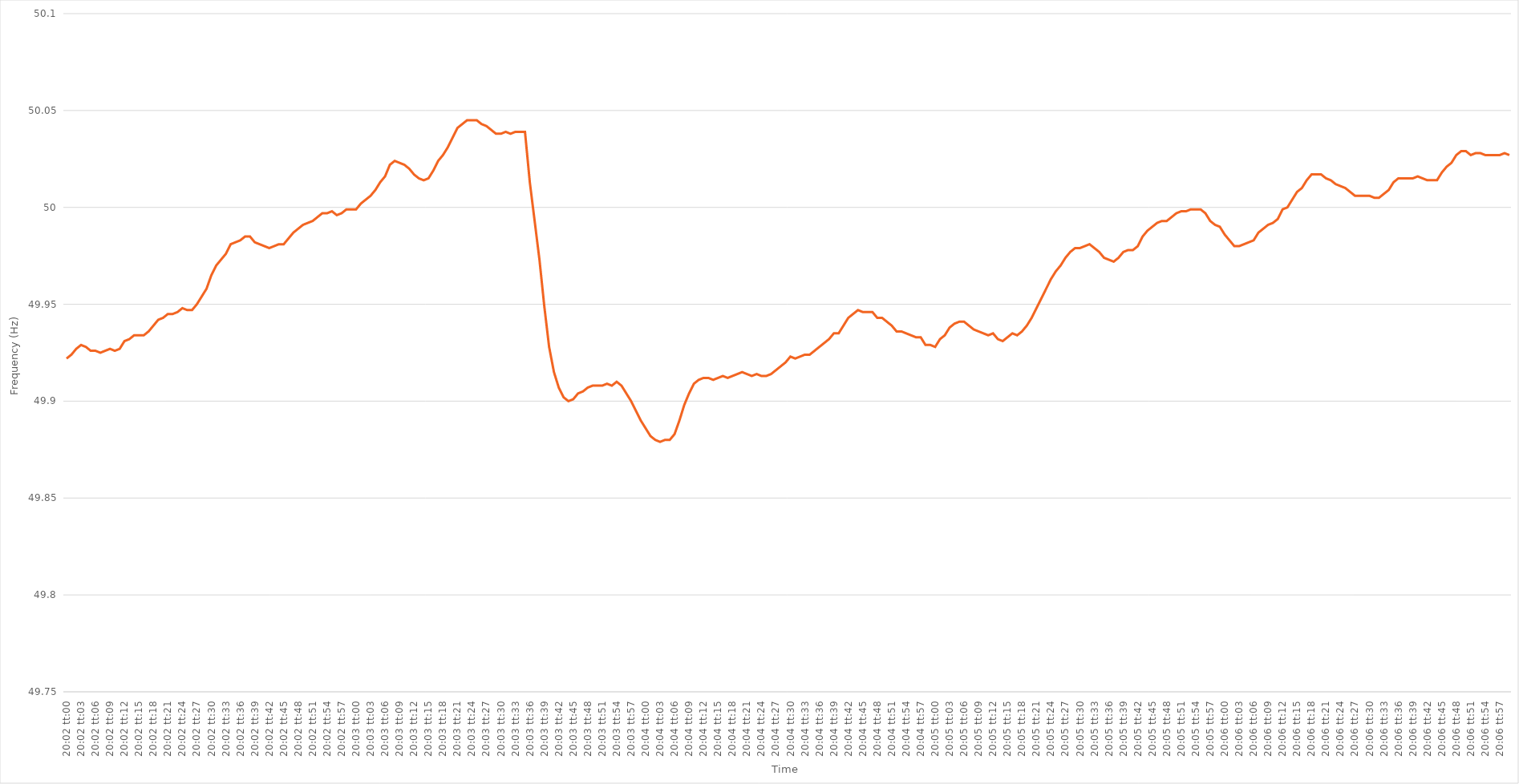
| Category | Series 0 |
|---|---|
| 0.8347222222222223 | 49.922 |
| 0.8347337962962963 | 49.924 |
| 0.8347453703703703 | 49.927 |
| 0.8347569444444445 | 49.929 |
| 0.8347685185185184 | 49.928 |
| 0.8347800925925926 | 49.926 |
| 0.8347916666666667 | 49.926 |
| 0.8348032407407407 | 49.925 |
| 0.8348148148148148 | 49.926 |
| 0.8348263888888888 | 49.927 |
| 0.834837962962963 | 49.926 |
| 0.8348495370370371 | 49.927 |
| 0.834861111111111 | 49.931 |
| 0.8348726851851852 | 49.932 |
| 0.8348842592592592 | 49.934 |
| 0.8348958333333334 | 49.934 |
| 0.8349074074074073 | 49.934 |
| 0.8349189814814815 | 49.936 |
| 0.8349305555555556 | 49.939 |
| 0.8349421296296297 | 49.942 |
| 0.8349537037037037 | 49.943 |
| 0.8349652777777777 | 49.945 |
| 0.8349768518518519 | 49.945 |
| 0.834988425925926 | 49.946 |
| 0.835 | 49.948 |
| 0.8350115740740741 | 49.947 |
| 0.8350231481481482 | 49.947 |
| 0.8350347222222222 | 49.95 |
| 0.8350462962962962 | 49.954 |
| 0.8350578703703704 | 49.958 |
| 0.8350694444444445 | 49.965 |
| 0.8350810185185185 | 49.97 |
| 0.8350925925925926 | 49.973 |
| 0.8351041666666666 | 49.976 |
| 0.8351157407407408 | 49.981 |
| 0.8351273148148147 | 49.982 |
| 0.8351388888888889 | 49.983 |
| 0.835150462962963 | 49.985 |
| 0.8351620370370371 | 49.985 |
| 0.8351736111111111 | 49.982 |
| 0.8351851851851851 | 49.981 |
| 0.8351967592592593 | 49.98 |
| 0.8352083333333334 | 49.979 |
| 0.8352199074074074 | 49.98 |
| 0.8352314814814815 | 49.981 |
| 0.8352430555555556 | 49.981 |
| 0.8352546296296296 | 49.984 |
| 0.8352662037037036 | 49.987 |
| 0.8352777777777778 | 49.989 |
| 0.8352893518518519 | 49.991 |
| 0.8353009259259259 | 49.992 |
| 0.8353125 | 49.993 |
| 0.835324074074074 | 49.995 |
| 0.8353356481481482 | 49.997 |
| 0.8353472222222221 | 49.997 |
| 0.8353587962962963 | 49.998 |
| 0.8353703703703704 | 49.996 |
| 0.8353819444444445 | 49.997 |
| 0.8353935185185185 | 49.999 |
| 0.8354050925925925 | 49.999 |
| 0.8354166666666667 | 49.999 |
| 0.8354282407407408 | 50.002 |
| 0.8354398148148148 | 50.004 |
| 0.8354513888888889 | 50.006 |
| 0.835462962962963 | 50.009 |
| 0.835474537037037 | 50.013 |
| 0.835486111111111 | 50.016 |
| 0.8354976851851852 | 50.022 |
| 0.8355092592592593 | 50.024 |
| 0.8355208333333333 | 50.023 |
| 0.8355324074074074 | 50.022 |
| 0.8355439814814815 | 50.02 |
| 0.8355555555555556 | 50.017 |
| 0.8355671296296295 | 50.015 |
| 0.8355787037037037 | 50.014 |
| 0.8355902777777778 | 50.015 |
| 0.8356018518518519 | 50.019 |
| 0.8356134259259259 | 50.024 |
| 0.835625 | 50.027 |
| 0.8356365740740741 | 50.031 |
| 0.8356481481481483 | 50.036 |
| 0.8356597222222222 | 50.041 |
| 0.8356712962962963 | 50.043 |
| 0.8356828703703704 | 50.045 |
| 0.8356944444444445 | 50.045 |
| 0.8357060185185184 | 50.045 |
| 0.8357175925925926 | 50.043 |
| 0.8357291666666667 | 50.042 |
| 0.8357407407407407 | 50.04 |
| 0.8357523148148148 | 50.038 |
| 0.8357638888888889 | 50.038 |
| 0.835775462962963 | 50.039 |
| 0.8357870370370369 | 50.038 |
| 0.8357986111111111 | 50.039 |
| 0.8358101851851852 | 50.039 |
| 0.8358217592592593 | 50.039 |
| 0.8358333333333333 | 50.013 |
| 0.8358449074074074 | 49.993 |
| 0.8358564814814815 | 49.973 |
| 0.8358680555555557 | 49.949 |
| 0.8358796296296296 | 49.928 |
| 0.8358912037037037 | 49.915 |
| 0.8359027777777778 | 49.907 |
| 0.8359143518518519 | 49.902 |
| 0.8359259259259259 | 49.9 |
| 0.8359375 | 49.901 |
| 0.8359490740740741 | 49.904 |
| 0.8359606481481481 | 49.905 |
| 0.8359722222222222 | 49.907 |
| 0.8359837962962963 | 49.908 |
| 0.8359953703703704 | 49.908 |
| 0.8360069444444443 | 49.908 |
| 0.8360185185185185 | 49.909 |
| 0.8360300925925926 | 49.908 |
| 0.8360416666666667 | 49.91 |
| 0.8360532407407407 | 49.908 |
| 0.8360648148148148 | 49.904 |
| 0.8360763888888889 | 49.9 |
| 0.8360879629629631 | 49.895 |
| 0.836099537037037 | 49.89 |
| 0.8361111111111111 | 49.886 |
| 0.8361226851851852 | 49.882 |
| 0.8361342592592593 | 49.88 |
| 0.8361458333333333 | 49.879 |
| 0.8361574074074074 | 49.88 |
| 0.8361689814814816 | 49.88 |
| 0.8361805555555555 | 49.883 |
| 0.8361921296296296 | 49.89 |
| 0.8362037037037037 | 49.898 |
| 0.8362152777777778 | 49.904 |
| 0.8362268518518517 | 49.909 |
| 0.8362384259259259 | 49.911 |
| 0.83625 | 49.912 |
| 0.8362615740740741 | 49.912 |
| 0.8362731481481481 | 49.911 |
| 0.8362847222222222 | 49.912 |
| 0.8362962962962963 | 49.913 |
| 0.8363078703703705 | 49.912 |
| 0.8363194444444444 | 49.913 |
| 0.8363310185185185 | 49.914 |
| 0.8363425925925926 | 49.915 |
| 0.8363541666666667 | 49.914 |
| 0.8363657407407407 | 49.913 |
| 0.8363773148148148 | 49.914 |
| 0.836388888888889 | 49.913 |
| 0.836400462962963 | 49.913 |
| 0.836412037037037 | 49.914 |
| 0.8364236111111111 | 49.916 |
| 0.8364351851851852 | 49.918 |
| 0.8364467592592592 | 49.92 |
| 0.8364583333333333 | 49.923 |
| 0.8364699074074075 | 49.922 |
| 0.8364814814814815 | 49.923 |
| 0.8364930555555555 | 49.924 |
| 0.8365046296296296 | 49.924 |
| 0.8365162037037037 | 49.926 |
| 0.8365277777777779 | 49.928 |
| 0.8365393518518518 | 49.93 |
| 0.836550925925926 | 49.932 |
| 0.8365625 | 49.935 |
| 0.8365740740740741 | 49.935 |
| 0.8365856481481481 | 49.939 |
| 0.8365972222222222 | 49.943 |
| 0.8366087962962964 | 49.945 |
| 0.8366203703703704 | 49.947 |
| 0.8366319444444444 | 49.946 |
| 0.8366435185185185 | 49.946 |
| 0.8366550925925926 | 49.946 |
| 0.8366666666666666 | 49.943 |
| 0.8366782407407407 | 49.943 |
| 0.8366898148148149 | 49.941 |
| 0.8367013888888889 | 49.939 |
| 0.8367129629629629 | 49.936 |
| 0.836724537037037 | 49.936 |
| 0.8367361111111111 | 49.935 |
| 0.8367476851851853 | 49.934 |
| 0.8367592592592592 | 49.933 |
| 0.8367708333333334 | 49.933 |
| 0.8367824074074074 | 49.929 |
| 0.8367939814814815 | 49.929 |
| 0.8368055555555555 | 49.928 |
| 0.8368171296296296 | 49.932 |
| 0.8368287037037038 | 49.934 |
| 0.8368402777777778 | 49.938 |
| 0.8368518518518518 | 49.94 |
| 0.8368634259259259 | 49.941 |
| 0.836875 | 49.941 |
| 0.836886574074074 | 49.939 |
| 0.8368981481481481 | 49.937 |
| 0.8369097222222223 | 49.936 |
| 0.8369212962962963 | 49.935 |
| 0.8369328703703703 | 49.934 |
| 0.8369444444444444 | 49.935 |
| 0.8369560185185185 | 49.932 |
| 0.8369675925925927 | 49.931 |
| 0.8369791666666666 | 49.933 |
| 0.8369907407407408 | 49.935 |
| 0.8370023148148148 | 49.934 |
| 0.837013888888889 | 49.936 |
| 0.8370254629629629 | 49.939 |
| 0.837037037037037 | 49.943 |
| 0.8370486111111112 | 49.948 |
| 0.8370601851851852 | 49.953 |
| 0.8370717592592593 | 49.958 |
| 0.8370833333333333 | 49.963 |
| 0.8370949074074074 | 49.967 |
| 0.8371064814814816 | 49.97 |
| 0.8371180555555555 | 49.974 |
| 0.8371296296296297 | 49.977 |
| 0.8371412037037037 | 49.979 |
| 0.8371527777777777 | 49.979 |
| 0.8371643518518518 | 49.98 |
| 0.8371759259259259 | 49.981 |
| 0.8371875000000001 | 49.979 |
| 0.837199074074074 | 49.977 |
| 0.8372106481481482 | 49.974 |
| 0.8372222222222222 | 49.973 |
| 0.8372337962962964 | 49.972 |
| 0.8372453703703703 | 49.974 |
| 0.8372569444444444 | 49.977 |
| 0.8372685185185186 | 49.978 |
| 0.8372800925925926 | 49.978 |
| 0.8372916666666667 | 49.98 |
| 0.8373032407407407 | 49.985 |
| 0.8373148148148148 | 49.988 |
| 0.837326388888889 | 49.99 |
| 0.8373379629629629 | 49.992 |
| 0.8373495370370371 | 49.993 |
| 0.8373611111111111 | 49.993 |
| 0.8373726851851852 | 49.995 |
| 0.8373842592592592 | 49.997 |
| 0.8373958333333333 | 49.998 |
| 0.8374074074074075 | 49.998 |
| 0.8374189814814814 | 49.999 |
| 0.8374305555555556 | 49.999 |
| 0.8374421296296296 | 49.999 |
| 0.8374537037037038 | 49.997 |
| 0.8374652777777777 | 49.993 |
| 0.8374768518518518 | 49.991 |
| 0.837488425925926 | 49.99 |
| 0.8375 | 49.986 |
| 0.8375115740740741 | 49.983 |
| 0.8375231481481481 | 49.98 |
| 0.8375347222222222 | 49.98 |
| 0.8375462962962964 | 49.981 |
| 0.8375578703703703 | 49.982 |
| 0.8375694444444445 | 49.983 |
| 0.8375810185185185 | 49.987 |
| 0.8375925925925927 | 49.989 |
| 0.8376041666666666 | 49.991 |
| 0.8376157407407407 | 49.992 |
| 0.8376273148148149 | 49.994 |
| 0.8376388888888888 | 49.999 |
| 0.837650462962963 | 50 |
| 0.837662037037037 | 50.004 |
| 0.8376736111111112 | 50.008 |
| 0.8376851851851851 | 50.01 |
| 0.8376967592592592 | 50.014 |
| 0.8377083333333334 | 50.017 |
| 0.8377199074074074 | 50.017 |
| 0.8377314814814815 | 50.017 |
| 0.8377430555555555 | 50.015 |
| 0.8377546296296297 | 50.014 |
| 0.8377662037037038 | 50.012 |
| 0.8377777777777777 | 50.011 |
| 0.8377893518518519 | 50.01 |
| 0.8378009259259259 | 50.008 |
| 0.8378125000000001 | 50.006 |
| 0.837824074074074 | 50.006 |
| 0.8378356481481481 | 50.006 |
| 0.8378472222222223 | 50.006 |
| 0.8378587962962962 | 50.005 |
| 0.8378703703703704 | 50.005 |
| 0.8378819444444444 | 50.007 |
| 0.8378935185185186 | 50.009 |
| 0.8379050925925925 | 50.013 |
| 0.8379166666666666 | 50.015 |
| 0.8379282407407408 | 50.015 |
| 0.8379398148148148 | 50.015 |
| 0.8379513888888889 | 50.015 |
| 0.8379629629629629 | 50.016 |
| 0.8379745370370371 | 50.015 |
| 0.8379861111111112 | 50.014 |
| 0.8379976851851851 | 50.014 |
| 0.8380092592592593 | 50.014 |
| 0.8380208333333333 | 50.018 |
| 0.8380324074074075 | 50.021 |
| 0.8380439814814814 | 50.023 |
| 0.8380555555555556 | 50.027 |
| 0.8380671296296297 | 50.029 |
| 0.8380787037037036 | 50.029 |
| 0.8380902777777778 | 50.027 |
| 0.8381018518518518 | 50.028 |
| 0.838113425925926 | 50.028 |
| 0.8381249999999999 | 50.027 |
| 0.838136574074074 | 50.027 |
| 0.8381481481481482 | 50.027 |
| 0.8381597222222222 | 50.027 |
| 0.8381712962962963 | 50.028 |
| 0.8381828703703703 | 50.027 |